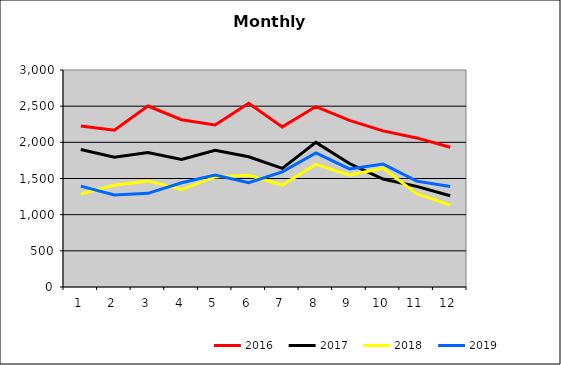
| Category | 2016 | 2017 | 2018 | 2019 |
|---|---|---|---|---|
| 0 | 2226.188 | 1900.859 | 1286.21 | 1394.576 |
| 1 | 2166.497 | 1795.105 | 1406.556 | 1272.617 |
| 2 | 2501.903 | 1859.386 | 1466.695 | 1295.231 |
| 3 | 2312.349 | 1764.013 | 1347.408 | 1441.267 |
| 4 | 2240.561 | 1891.399 | 1522.181 | 1548.691 |
| 5 | 2540.235 | 1800.236 | 1543.945 | 1443.46 |
| 6 | 2213.485 | 1640.121 | 1409.491 | 1591.615 |
| 7 | 2494.361 | 1999.331 | 1694.901 | 1854.799 |
| 8 | 2304.009 | 1706.874 | 1545.104 | 1631.933 |
| 9 | 2158.544 | 1492.036 | 1642.816 | 1701.214 |
| 10 | 2060.966 | 1390.86 | 1288.934 | 1463.951 |
| 11 | 1932.97 | 1261.902 | 1131.485 | 1390.399 |